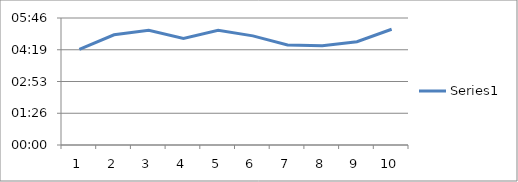
| Category | Series 0 |
|---|---|
| 0 | 0.003 |
| 1 | 0.003 |
| 2 | 0.004 |
| 3 | 0.003 |
| 4 | 0.004 |
| 5 | 0.003 |
| 6 | 0.003 |
| 7 | 0.003 |
| 8 | 0.003 |
| 9 | 0.004 |